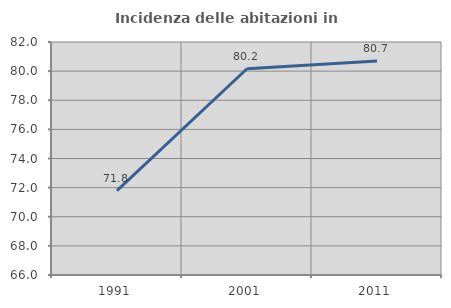
| Category | Incidenza delle abitazioni in proprietà  |
|---|---|
| 1991.0 | 71.794 |
| 2001.0 | 80.163 |
| 2011.0 | 80.694 |